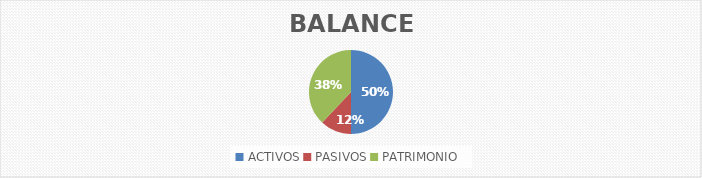
| Category | VALOR |
|---|---|
| ACTIVOS | 27737583.7 |
| PASIVOS | 6677503.82 |
| PATRIMONIO | 21060079.88 |